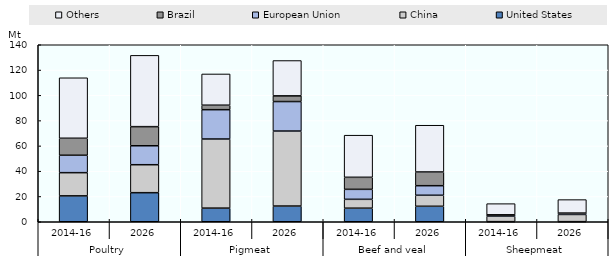
| Category | United States | China | European Union | Brazil | Others |
|---|---|---|---|---|---|
| 0 | 20.467 | 18.358 | 13.786 | 13.434 | 47.83 |
| 1 | 22.999 | 22.115 | 14.99 | 15.122 | 56.382 |
| 2 | 10.784 | 54.663 | 23.194 | 3.546 | 24.72 |
| 3 | 12.422 | 59.309 | 23.342 | 4.5 | 27.954 |
| 4 | 10.735 | 7.005 | 7.902 | 9.519 | 33.31 |
| 5 | 12.243 | 8.706 | 7.571 | 10.855 | 36.967 |
| 6 | 0.075 | 4.372 | 0.951 | 0.085 | 8.835 |
| 7 | 0.08 | 5.694 | 1.011 | 0.086 | 10.645 |